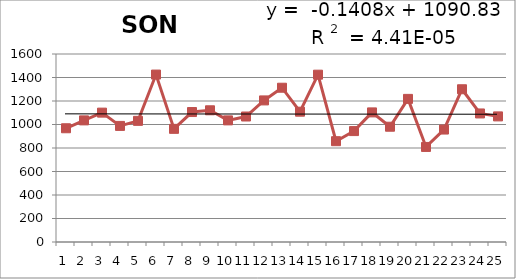
| Category | 1988-2012 |
|---|---|
| 0 | 968 |
| 1 | 1035 |
| 2 | 1101 |
| 3 | 988 |
| 4 | 1031 |
| 5 | 1425 |
| 6 | 963 |
| 7 | 1106 |
| 8 | 1121 |
| 9 | 1035 |
| 10 | 1068 |
| 11 | 1205 |
| 12 | 1313 |
| 13 | 1109 |
| 14 | 1424 |
| 15 | 858 |
| 16 | 944 |
| 17 | 1103 |
| 18 | 981 |
| 19 | 1218 |
| 20 | 809 |
| 21 | 957 |
| 22 | 1300 |
| 23 | 1094 |
| 24 | 1069 |